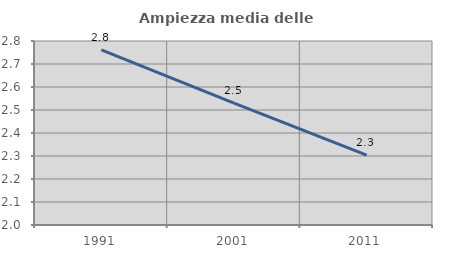
| Category | Ampiezza media delle famiglie |
|---|---|
| 1991.0 | 2.761 |
| 2001.0 | 2.53 |
| 2011.0 | 2.304 |